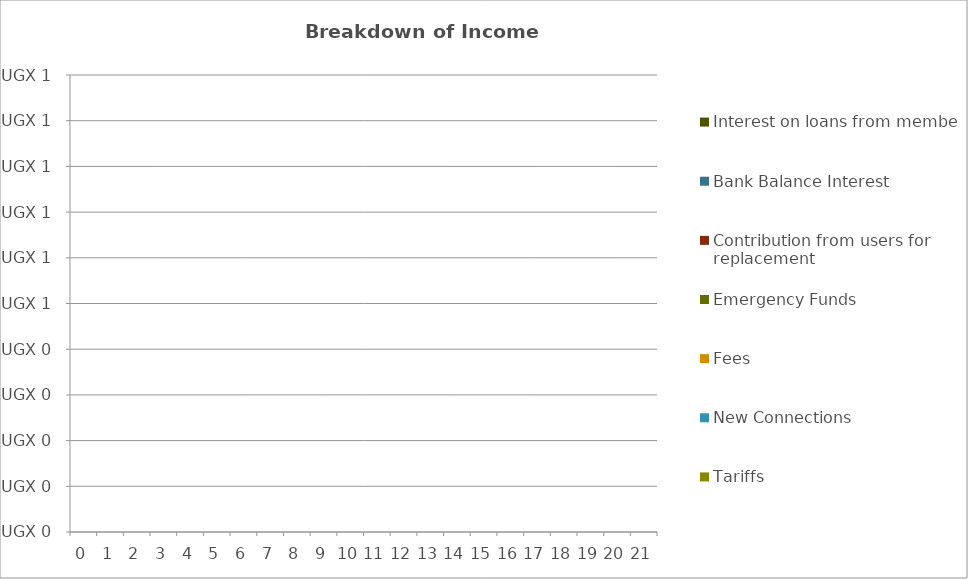
| Category |  Tariffs  |  New Connections  |  Fees  |  Emergency Funds  |  Contribution from users for replacement  |  Bank Balance Interest  |  Interest on loans from members  |
|---|---|---|---|---|---|---|---|
| 0.0 | 0 | 0 | 0 | 0 | 0 | 0 | 0 |
| 1.0 | 0 | 0 | 0 | 0 | 0 | 0 | 0 |
| 2.0 | 0 | 0 | 0 | 0 | 0 | 0 | 0 |
| 3.0 | 0 | 0 | 0 | 0 | 0 | 0 | 0 |
| 4.0 | 0 | 0 | 0 | 0 | 0 | 0 | 0 |
| 5.0 | 0 | 0 | 0 | 0 | 0 | 0 | 0 |
| 6.0 | 0 | 0 | 0 | 0 | 0 | 0 | 0 |
| 7.0 | 0 | 0 | 0 | 0 | 0 | 0 | 0 |
| 8.0 | 0 | 0 | 0 | 0 | 0 | 0 | 0 |
| 9.0 | 0 | 0 | 0 | 0 | 0 | 0 | 0 |
| 10.0 | 0 | 0 | 0 | 0 | 0 | 0 | 0 |
| 11.0 | 0 | 0 | 0 | 0 | 0 | 0 | 0 |
| 12.0 | 0 | 0 | 0 | 0 | 0 | 0 | 0 |
| 13.0 | 0 | 0 | 0 | 0 | 0 | 0 | 0 |
| 14.0 | 0 | 0 | 0 | 0 | 0 | 0 | 0 |
| 15.0 | 0 | 0 | 0 | 0 | 0 | 0 | 0 |
| 16.0 | 0 | 0 | 0 | 0 | 0 | 0 | 0 |
| 17.0 | 0 | 0 | 0 | 0 | 0 | 0 | 0 |
| 18.0 | 0 | 0 | 0 | 0 | 0 | 0 | 0 |
| 19.0 | 0 | 0 | 0 | 0 | 0 | 0 | 0 |
| 20.0 | 0 | 0 | 0 | 0 | 0 | 0 | 0 |
| 21.0 | 0 | 0 | 0 | 0 | 0 | 0 | 0 |